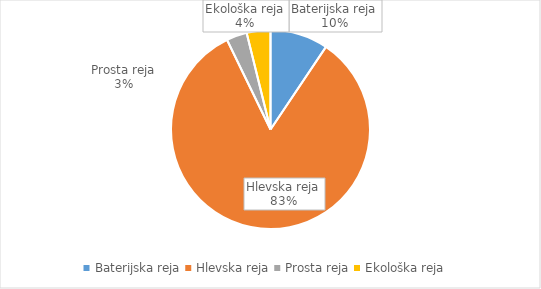
| Category | Količina kosov jajc |
|---|---|
| Baterijska reja | 257159 |
| Hlevska reja | 2278730 |
| Prosta reja | 91167 |
| Ekološka reja | 105215 |